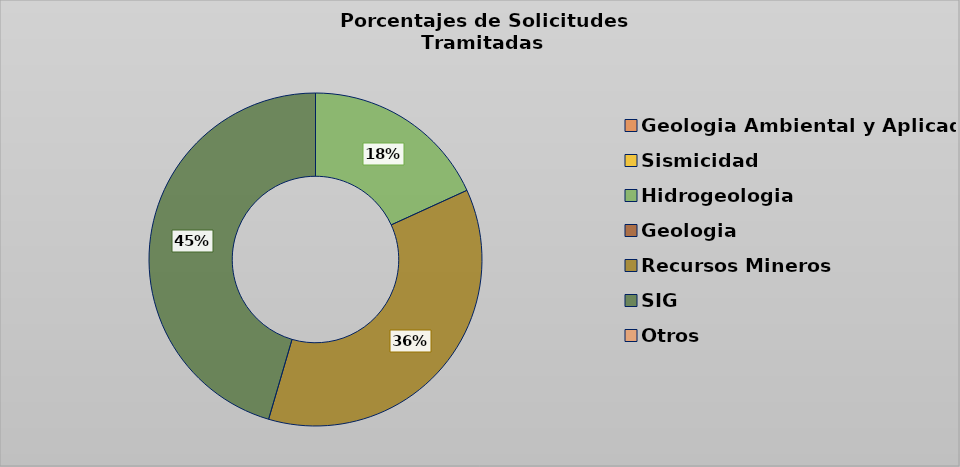
| Category | Series 0 |
|---|---|
| Geologia Ambiental y Aplicada | 0 |
| Sismicidad | 0 |
| Hidrogeologia | 18.182 |
| Geologia | 0 |
| Recursos Mineros | 36.364 |
| SIG | 45.455 |
| Otros | 0 |